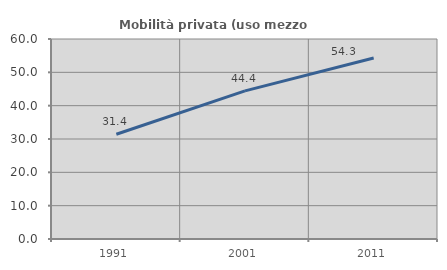
| Category | Mobilità privata (uso mezzo privato) |
|---|---|
| 1991.0 | 31.429 |
| 2001.0 | 44.444 |
| 2011.0 | 54.286 |